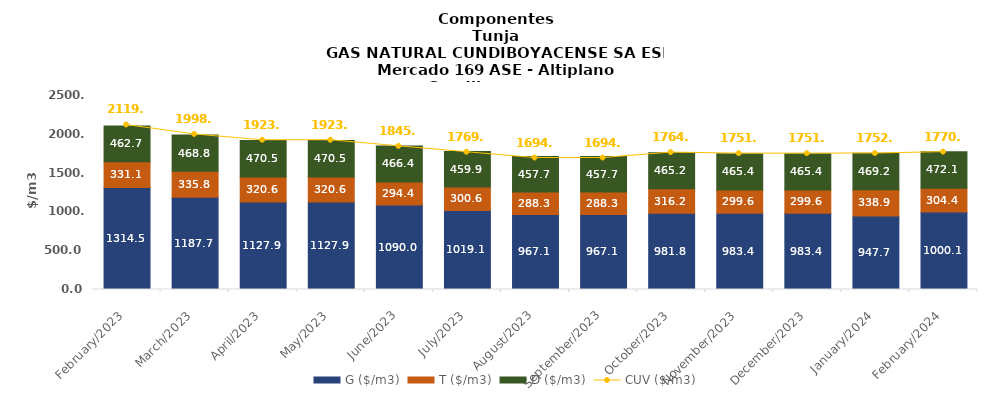
| Category | G ($/m3) | T ($/m3) | D ($/m3) |
|---|---|---|---|
| 2023-02-01 | 1314.49 | 331.09 | 462.69 |
| 2023-03-01 | 1187.7 | 335.79 | 468.75 |
| 2023-04-01 | 1127.9 | 320.55 | 470.54 |
| 2023-05-01 | 1127.9 | 320.55 | 470.54 |
| 2023-06-01 | 1090.01 | 294.4 | 466.35 |
| 2023-07-01 | 1019.05 | 300.55 | 459.92 |
| 2023-08-01 | 967.08 | 288.3 | 457.73 |
| 2023-09-01 | 967.08 | 288.3 | 457.72 |
| 2023-10-01 | 981.83 | 316.2 | 465.18 |
| 2023-11-01 | 983.39 | 299.62 | 465.37 |
| 2023-12-01 | 983.39 | 299.62 | 465.37 |
| 2024-01-01 | 947.72 | 338.94 | 469.19 |
| 2024-02-01 | 1000.09 | 304.43 | 472.07 |